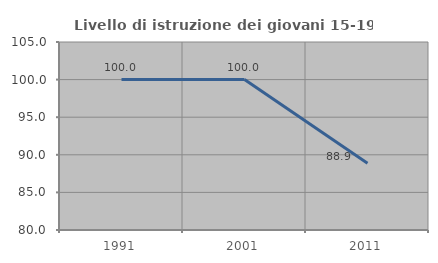
| Category | Livello di istruzione dei giovani 15-19 anni |
|---|---|
| 1991.0 | 100 |
| 2001.0 | 100 |
| 2011.0 | 88.889 |